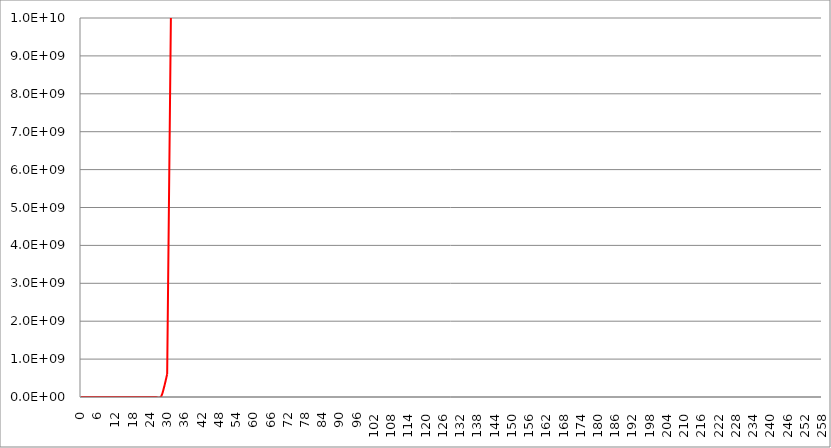
| Category | Series 1 | Series 0 | Series 2 |
|---|---|---|---|
| 0.0 | 1 |  |  |
| 2.0 | 0.167 |  |  |
| 4.0 | 0.033 |  |  |
| 6.0 | 0.024 |  |  |
| 8.0 | 0.033 |  |  |
| 10.0 | 0.076 |  |  |
| 12.0 | 0.253 |  |  |
| 14.0 | 1.167 |  |  |
| 16.0 | 7.092 |  |  |
| 18.0 | 54.971 |  |  |
| 20.0 | 529.124 |  |  |
| 22.0 | 6192.123 |  |  |
| 24.0 | 86580.253 |  |  |
| 26.0 | 1425517.167 |  |  |
| 28.0 | 27298231.068 |  |  |
| 30.0 | 601580873.901 |  |  |
| 32.0 | 15116315767.092 |  |  |
| 34.0 | 429614643061.166 |  |  |
| 36.0 | 13711655205088.3 |  |  |
| 38.0 | 488332318973593 |  |  |
| 40.0 | 19296579341940000 |  |  |
| 42.0 | 841693047573682048 |  |  |
| 44.0 | 40338071854059397120 |  |  |
| 46.0 | 2115074863808190087168 |  |  |
| 48.0 | 120866265222964993589248 |  |  |
| 50.0 | 7500866746076959871074304 |  |  |
| 52.0 | 503877810148105991634288640 |  |  |
| 54.0 | 36528776484818100285333307392 |  |  |
| 56.0 | 2849876930245079791873300627456 |  |  |
| 58.0 | 238654274996835986249252920623104 |  |  |
| 60.0 | 21399949257225297965998376306606080 |  |  |
| 62.0 | 2050097572347799999128970884691263488 |  |  |
| 64.0 | 209380059113462999655078293539712401408 |  |  |
| 66.0 | 22752696488463500355748382889183920783360 |  |  |
| 68.0 | 2625771028623949983604535719154945844314112 |  |  |
| 70.0 | 321250821027180000515785294732874872220811264 |  |  |
| 72.0 | 41598278166794701836995474499677710512679813120 |  |  |
| 74.0 | 5692069548203519879873395342648049302404421648384 |  |  |
| 76.0 | 821836294197844945882379331617412975382622940168192 |  |  |
| 78.0 | 125029043271669004265672538810587066208854537498787840 |  |  |
| 80.0 | 20015583233248299273060248810983037207183390985504686080 |  |  |
| 82.0 | 3367498291536429889742584668517084527118679719132782395392 |  |  |
| 84.0 | 594709705031353966831865733318690522196640708551122763120640 |  |  |
| 86.0 | 110119103236278991192874144928390906998836631589920935801520128 |  |  |
| 88.0 | 21355259545253499155833472030530734652087202095339266523889926144 |  |  |
| 90.0 | 4332889698664109656916260340162327325437602608158987073507442032640 |  |  |
| 92.0 | 918855282416692934982648689065233704718626917800949434605044538277888 |  |  |
| 94.0 | 203468967763290001478474883531345159969757060450888804572763599038054400 |  |  |
| 96.0 | 47003833958035698772166297082544736598325403555761484637164816364659015680 |  |  |
| 98.0 | 11318043445484199595646445284961541634624607754064182307140188575751164919808 |  |  |
| 100.0 | 2838224957069369912654063838504587049657012097130306235152762273965127447347200 |  |  |
| 102.0 | 740642489796788002793290256079108718339050229650421494965689234978434532555882496 |  |  |
| 104.0 | 200964548027565998700810607919817668462847451755206385721930395924799144218570260480 |  |  |
| 106.0 | 56657170050805900678245246154332152579435493718065801451989397090247754204784923508736 |  |  |
| 108.0 | 16584511154136198235069861113975054915267231240012461324050189760822034806819593140568064 |  |  |
| 110.0 | 5036885995049229697333508488683725004649803204780207131581875845982131266300483844970643456 |  |  |
| 112.0 | 1586146823765809994362909491317157961428200742313721896449835650152728445747382070886738690048 |  |  |
| 114.0 | 517567436175456014751003719773002119384391877475871305469676903544876341783763149736547985653760 |  |  |
| 116.0 | 174889218402171006690813144368258450805068690532903761425890458554677043645572196896880042392420352 |  |  |
| 118.0 | 61160519994952096881522973758954159980528392609962389273987206861247497861369054262495311073829191680 |  |  |
| 120.0 | 22122776912707801364884541429029190554556378866655452137957440121669468122813877766444819795464714977280 |  |  |
| 122.0 | 8272277679877079561800338921183541621920802563739881608263931837086800267907520279581641005345856244678656 |  |  |
| 124.0 | 3195892511141569804801675221983064959916054350650205504685172959528403066346333843186809741818955429427806208 |  |  |
| 126.0 | 1275008222338769969015921025815713008977846513496173394306755971916508473171113010816665318718233101046774759424 |  |  |
| 128.0 | 525009230867740971710059938972836169819735011829241947104421889568359398500029579153788180970434903844407247634432 |  |  |
| 130.0 | 223018178942415986376557582182684786329082806976649120491193383046553756638764150240237595848721911815115341188562944 |  |  |
| 132.0 | 97684521930955207422040844565506447358879006469504948368475931044246603241067769598795828587789393731497358175298912256 |  |  |
| 134.0 | 44098361978452903950597492748136064541374438120069114236574329545338276615668682355283839169265590277132422100264805203968 |  |  |
| 136.0 | 20508570886463999712817617811204347764581963558869055109643027743349319302257869967714920145132226879824535764349718712287232 |  |  |
| 138.0 | 9821443327979109621269038657740631561177815630041017756863472417363039736530816918262770738709809886455825478779966785371242496 |  |  |
| 140.0 | 4841260079820880053382010223325977464747820900775834988695297199602580964103174273181389393908064029545943659592636707296266682368 |  |  |
| 142.0 | 2455308880148090036424046044739731565118970496732055957211489502800312857353010243042754728292260170338786907520132537228370324226048 |  |  |
| 144.0 | 1280692680408470075028097602259696709101799063330236802318431481670171212859141382597036285614388467168216422172657672143168661654339584 |  |  |
| 146.0 | 686761671046684968032757454892245650833569674972964461119744407207098623104360619114279004924857864932865465293250062374826564809115303936 |  |  |
| 148.0 | 378464685819691016210958657680082781249048936661420887487610277686963441847305643979294466626368079904119837566011813840175608034999574462464 |  |  |
| 150.0 | 214261012506651996728206737118146633093502584618144547346341858838478274283842870597327398633492807580507007904081983944220549011093178653081600 |  |  |
| 152.0 | 124567271371836000188544662381231662934526154674974270924977007295294828028113373578384405377162121295372125315412404795348416560471899772362424320 |  |  |
| 154.0 | 74345787550999996756569703050355414857598780364182930219695294898402751073201099786960349712110315357865553681264770109329907783862406461813340241920 |  |  |
| 156.0 | 45535795304641697914596838496836998366946295562341879486342110200785007306373224394536151454191300105693972515342466993920972837630939106081048839061504 |  |  |
| 158.0 | 28612112816858799009194834986143128853606671163857995411984333734784977732377760137447965668812075765514971185103984511427302124423460858688720039302922240 |  |  |
| 160.0 | 18437723552033799834559864126085996573638388101821878813712767265310985921283979846430507075939227735561390197457452843953909019941387057315063120568296407040 |  |  |
| 162.0 | 12181154536220999717695683151169615428909467760738942935816097668221970297243723432616917228542517459939948859012010562526118399568745739642193791820357879988224 |  |  |
| 164.0 | 8248218718531410569519588291116642522414388780629934608708109673418839879522486229214460234821107655676991727690469402503809313126847370615018471493410939090239488 |  |  |
| 166.0 | 5722587793783290125042896390778825816324368951710284612162034244553159301650963693194590370414973919214286959827079131663987252446362588098206320661693037791810682880 |  |  |
| 168.0 | 4066853052505909621054408578099132597927578818691180063573943228211857465954680360554570712504805532660406374897731012641884467487553437826128635928993371638253790167040 |  |  |
| 170.0 | 2959609206464200070529044368403923283197564983731872129427224159820565071986806886223691771698635819618375666004338208038414652553026399076288815795718380380377231157886976 |  |  |
| 172.0 | 2204952256518940002824373226576765287844898704492299112069059381753426219201951048388190875816012079682434763133297161596786722396283532695321265659235496132026546179637510144 |  |  |
| 174.0 | 1681259707288950039883362589635324978523755237298952244683129557942178870942360200861884416538072774588930025421264935031574642952334154546372266976294302427254160912114618728448 |  |  |
| 176.0 | 1311673621355690050488061903141833328033734307676609222268726837269658309115017311476284999786207078111613339546781241292224950693521912738656654843778718363025517376807452624814080 |  |  |
| 178.0 | 1046789400947799960315772294884662038510916240258441101332716709882845944271039167652973626446890399441186117632601449154281679710691804994518228548065102829193345991664493566676172800 |  |  |
| 180.0 | 854328935788336981714442459306748840907083761137108519237160672679560157883724465594724852840867254275233724221806611734165714207506021553318509514237984929612122933423682928483778953216 |  |  |
| 182.0 | 712878213224864973886076143712259046753903328303699422587066098477407805381629396815375311727733480190965101163738114710990910079895607174419152670824713868306999238000523735657836162580480 |  |  |
| 184.0 | 608029314555358036600584851779870558108489035199076436482171430661333472100597651702509116229274568872270327221985466384480785367888636743829150375723191296906952686253174267005483897138970624 |  |  |
| 186.0 | 529967764248499017163068768795025234273638926293611394765718652141366023707368876712621788097054696108773999916531712550329050248850322641292216385721169245329702582139942117538023375074207203328 |  |  |
| 188.0 | 471942591687458007169027942671047669929975120662195870524120400686482854270678302992795458714793433977318613518771271437360144268960474362546637559217021011507575641373356374872802199535565701906432 |  |  |
| 190.0 | 429284137914029010242884845180289998657160826575490486946138870670647964495262927334868359205029055372504728611382453717876685906058881953867939679674105936216563181121492307042208155504527064355045376 |  |  |
| 192.0 | 398767449682321984062298009218519689649989466289785487834655733642357600334467642328625518341967766501688412607234808520323777478498715912542213619090401840759780790919176460512625556945188946548541620224 |  |  |
| 194.0 | 378197804193588013487837365739928777086792688006428575825745278269641330806977903919693670969088503929559653329804882786395333208030689228935036106535033399446876724696851094871730522726989516698693448761344 |  |  |
| 196.0 | 366142336836810969998475140008112480700229251638653302348811225535485189798098992544464537958411762415080002482758754723159790093078145938636641701946599551018668623457093777110722085441428616470215275009015808 |  |  |
| 198.0 | 361760902723728001159028895750717524367100065368195139752350458434681439054556311321908272462018910645949139324929065524999901556097747129743192502299710453770152752019913986266968409185443155723363581999429189632 |  |  |
| 200.0 | 364707726451913027290746468745719102439592021338192857254159693606700866052328748862327518067858419906834314439483327940215667241603478050777009294265318588271340620897789154850316686153885364378408574926415172993024 |  |  |
| 202.0 | 375087554364543984850559253606629565865322917973679669087792346390836373560678430105472051606929723384448543144822399904713230768751714445707893279470227175024721074258101103994301987775833235353999883351850221970653184 |  |  |
| 204.0 | 393458672964389979548775946783067409808797905440936094431189718682995556683832217277145036090501990709654866106385040929867984360319899021700849834817331607788256043364787560024218891271793723712750937735919252635843035136 |  |  |
| 206.0 | 420882111481900017673505033763245397744138888773909049130263690965468491887674469140643493682686946219842613036853142375144348621807364600574664428652809933923082022783415081931561086565818568157556872104641758603211008114688 |  |  |
| 208.0 | 459022962206179007100943844427469014259727630657788029437190873652454046215442083844080800801193194043026820561448063452950256901436541854458252890582892001282688441175690622186835625173403950273097932838774399321947832718458880 |  |  |
| 210.0 | 510317257726295029617111582586537257947797497510612873000867690135005576676624923274938361054550121826057362836338249796118676381632863021980344914243552263499179621776776440049266302111409589354416875718727208303749060336755408896 |  |  |
| 212.0 | 578227623036569012559233285666984667627940138892401637551311566680381676656401556069756751348195985776744718323865312552870407238982946367421211515990890459666340928563626120036832094650402793772445102420653662037658661404259523756032 |  |  |
| 214.0 | 667624821678358024701922684454877700539092678742375623988434630789071492590227148607599206281223286817010429881049714149226025382036910309993369782642446136765438518413954280422522683145079669909480962157169267092902365784843330699395072 |  |  |
| 216.0 | 785353076444503985146417588886993380469839673903614634607506087888029853824634736304887632962073720109586848604135051074023817575565570788653085666012201814147761644462093336777125083527995082406672160629406162067636971189493495061486239744 |  |  |
| 218.0 | 941068940670587053405012669220559641625548558599104009235222313364356956248532923171161629651256859876487343175212868282770242537235309792711682595747749196622787562575856795608068756801436235794102230981687419167663164498770588534634274881536 |  |  |
| 220.0 | 1148493387346509927216510043334626385702787360091557369777765896016829925313270725248903419610459974400477647740635076852732654777393874887470884514512520512869027557050802164918224479733336885665561650622380055555015934893162487247319802845331456 |  |  |
| 222.0 | 1427295874284869946740004447455563989154002331667529518910794422340820451334658771094858237945670752007502024340395480507472305815066516363097335376673694407352163140118296971903057525236217083165785453910368237611139890165355345546936618858454188032 |  |  |
| 224.0 | 1805955958690929917932245750681809319499712991772727353290554719628561967348722827413470302693968304492271043271389541431931622157682421317975908499672697777978099827997807911987723936479280479163577791555221968956773994879563640963799188808659147685888 |  |  |
| 226.0 | 2326153530766079845091689917461061890265081040022904234352586422309201813251686369368223518079565456055477212921478583325376891458962621488772260183809676831905654823384409086309485013462188604225915365544449982680387362298489240422986959407225964110807040 |  |  |
| 228.0 | 3049575171549950021342438118248026160620153976428428180199320963135445502451408035285350965112757159871535691815355996309881653420920435310279330373476063546654999688303087708328287668855271656258612646049514497731252784532910083116956256821113262051870900224 |  |  |
| 230.0 | 4068580607643389700544625274086257033326660588674874944105172883393995850441219196443824928226666772895252409117765016438043249274184058375432520536120007346649606976931439983630577834795204525267725119457187946404717168309659143932040432465758969653850150010880 |  |  |
| 232.0 | 5523103132197429935898445598467603349758855691507045919261072290228219080949748438102551320905770396813916404110453149857211139668175789376047912175429412172870160884755962840251602777523318447018658608370075712595019006160421955569711476637037492894356598056550400 |  |  |
| 234.0 | 7627727939643430350559514600839652027334348685408792412593320258581500922944085694395581222579172707497103840499663397173184753838136288717947902082258775572426407232388488966679605058358434413398749479949309524591918899102358263240340459002181286632372914927706308608 |  |  |
| 236.0 | 10715571119697799455159929945283937808303810597422406479907762712889234551427721554517968924491372436083924726841722947020515185524057093320224117080236011386648812633657016004446638535537708937890751871271834629413045009833737290104428299634191430475461992522761791078400 |  |  |
| 238.0 | 15310200895969099642184424418009100970018636743410919054418873691648968210867386800914934653894542907829943710858330347069571765193076178380985317290523982153531937411928322671268881106069690512086594555553879381696709605003671991207046708445168987732499749178675069680877568 |  |  |
| 240.0 | 22244891682179800309075031149395265907506407497658562221845667503143782848557319483826482428962060265351744109270004137082851428108977738501375634117531474137252277021158663645569248368158270972105123459691731731546523376437528660917190252000077646930115974032014031505344954368 |  |  |
| 242.0 | 32862679190690099600460150190742254327734540986025790251793242270341345375709186822378846250848521228133256266904390959803861747820423068606650045707804299109082768802991943308470483438625240336086261651550595902925197805715232108617456888138905514988218644107445852376221983178752 |  |  |
| 244.0 | 49355928955960298460538967056042922214688628701973417433095821146973940528673121381173272290761569701150874348438285824239680218311450326747929343028431399374880310193485889422104865442381957962604351615854091687095541494436819152513724945796284376823519115989674285940303553366065152 |  |  |
| 246.0 | 75349571200832502448087604385473658393196073422988507396834869456197786539405199346864098608617654823014490877538215724844394345879278408633111930722076531353301225893619826782500488205558039495197766098978716825777808556976316899732278578287940336152652597753048554659605953367081222144 |  |  |
| 248.0 | 116914851545841003826199942684503745071339038827862086250982854130605404588200869590862517815697897751529811046143425532854828854564704780763757089523085965225039532073692415755278377323407954852719125139312398215969453991979700536400362562269081364276716727936695038788462984447147099815936 |  |  |
| 250.0 | 184352614678388994204809010673070355627408522646878261363026046365668232613573636185495011396793321531541209310685301692783978562708623779009760621075540310704623385517353299669937177822734893790819443814192140000308209602296179366991244406352419780466148659395251685116473019203684674033418240 |  |  |
| 252.0 | 295368261729679982952531642586912737965876974856394173904458055284002659547584824281161886976016757517666373128452740742360569240360586339452917765416095935526585945489390915745127382895349990616290551819472210006703947419259272353507152023357645552823109294810137518682635935373995285506447900672 |  |  |
| 254.0 | 480793212775015011635917182360079753577597365899154861402325701746443979240398649148879732729366759866156585859621662470643832483641079705940542229910823071860559314595566732766605460852018127403914323985764579627397988494059185491139293901918434402908504943340476255048345948862320385623450904952832 |  |  |
| 256.0 | 795021250458852059917405468976585496054051594344205206979603099381559748131098997377190253798721336690867458120216217985205354575346168868658094879300294716295762137952658904325884154104874086841753570023338000184938460957643728598825502776963178027625617750999179116779157910555949296886495819266523136 |  |  |
| 258.0 | 1335278418735459975620856778693893695167460405776924506849090948293833483786241120375492559054256607205696062283174282141616044177073985013768997686594641420686967941737889696857806418720260318382589199154238600379563805293325140425003596417222771567608685113023414927330652624107767617409670912192720928768 |  |  |